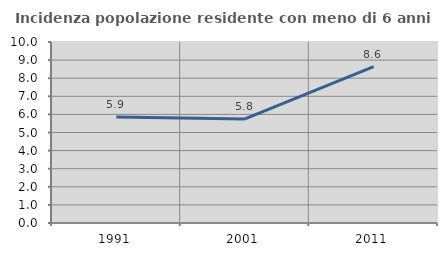
| Category | Incidenza popolazione residente con meno di 6 anni |
|---|---|
| 1991.0 | 5.851 |
| 2001.0 | 5.752 |
| 2011.0 | 8.641 |